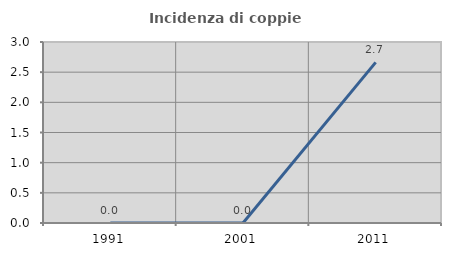
| Category | Incidenza di coppie miste |
|---|---|
| 1991.0 | 0 |
| 2001.0 | 0 |
| 2011.0 | 2.662 |